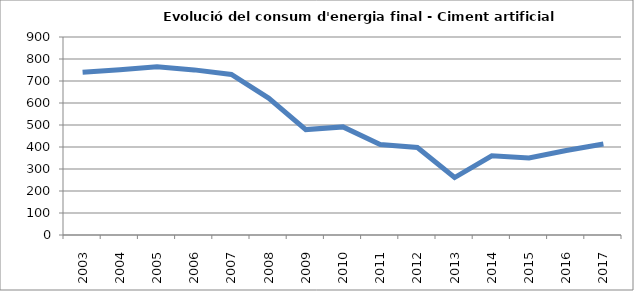
| Category | 739,7 751,5 764,3 750,5 729,6 622,4 479,1 491,3 411,1 397,6 261,1 360,2 350,1 384,1 413,5 |
|---|---|
| 2003.0 | 739.7 |
| 2004.0 | 751.5 |
| 2005.0 | 764.3 |
| 2006.0 | 750.5 |
| 2007.0 | 729.6 |
| 2008.0 | 622.4 |
| 2009.0 | 479.1 |
| 2010.0 | 491.3 |
| 2011.0 | 411.1 |
| 2012.0 | 397.6 |
| 2013.0 | 261.1 |
| 2014.0 | 360.2 |
| 2015.0 | 350.1 |
| 2016.0 | 384.1 |
| 2017.0 | 413.5 |